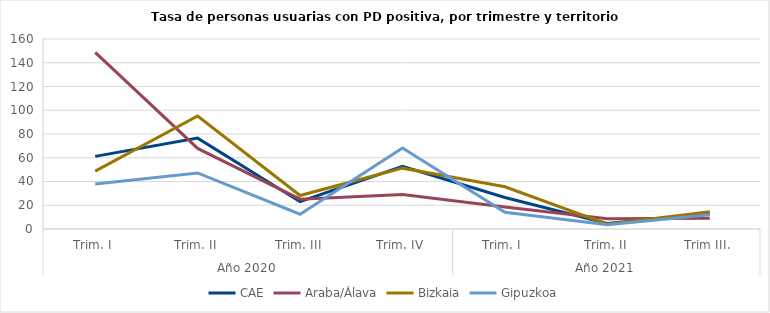
| Category | CAE | Araba/Álava | Bizkaia | Gipuzkoa |
|---|---|---|---|---|
| 0 | 61.172 | 148.8 | 48.716 | 37.912 |
| 1 | 76.527 | 67.862 | 95.204 | 47.197 |
| 2 | 22.981 | 25.088 | 28.188 | 12.458 |
| 3 | 52.685 | 29.112 | 51.236 | 68.183 |
| 4 | 26.502 | 18.522 | 35.574 | 14.063 |
| 5 | 4.676 | 8.685 | 4.108 | 3.506 |
| 6 | 12.921 | 9.018 | 14.548 | 12.034 |